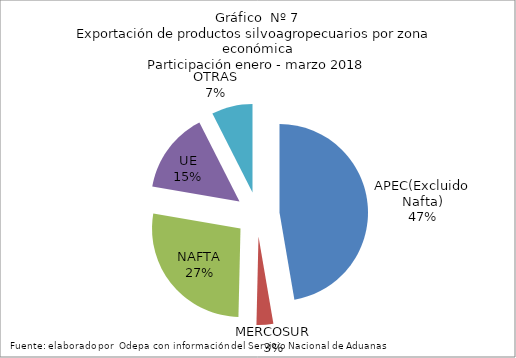
| Category | Series 0 |
|---|---|
| APEC(Excluido Nafta) | 2276519.948 |
| MERCOSUR | 147659.811 |
| NAFTA | 1315862.406 |
| UE | 712170.026 |
| OTRAS | 360267.809 |